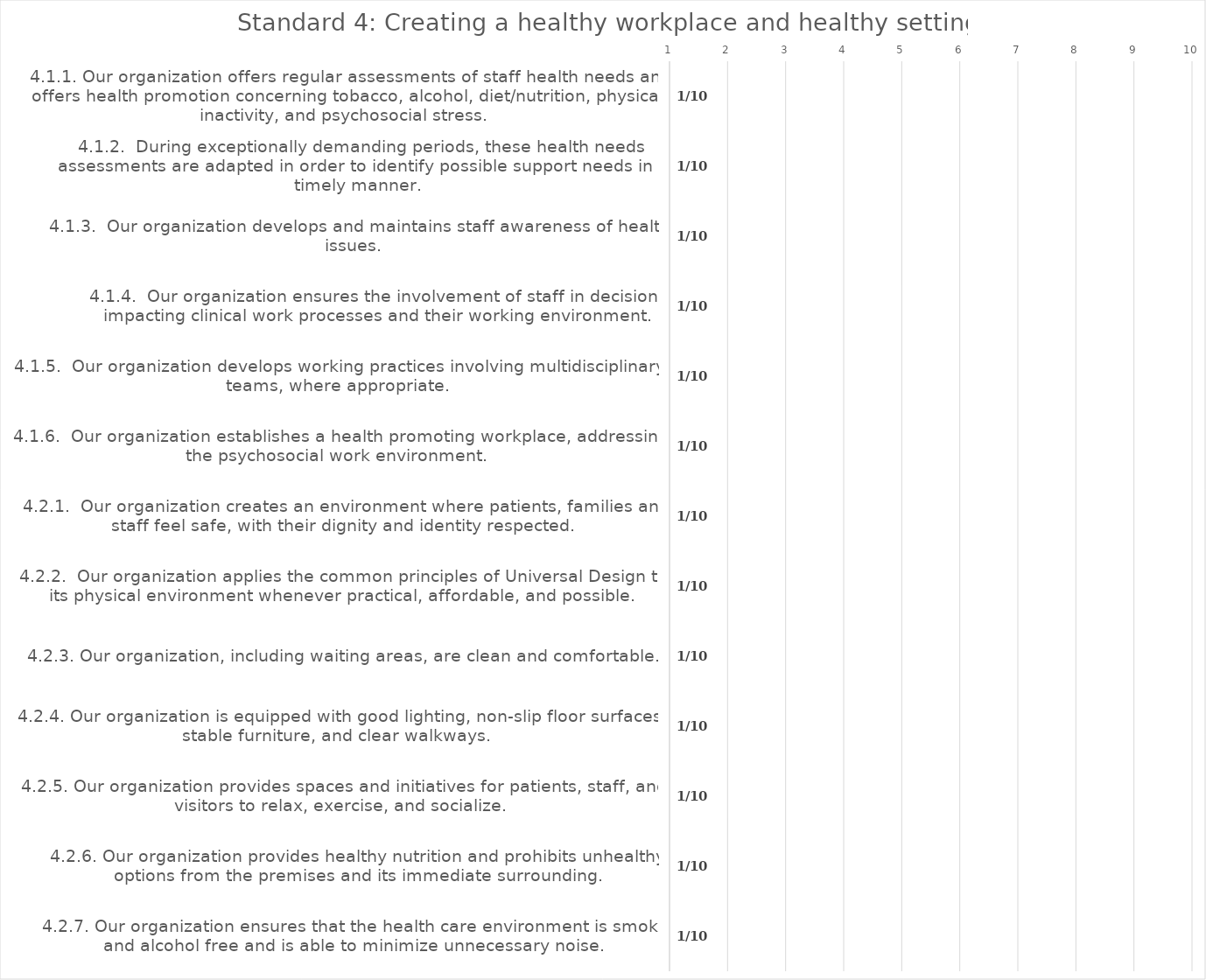
| Category | value |
|---|---|
| 4.1.1. Our organization offers regular assessments of staff health needs and offers health promotion concerning tobacco, alcohol, diet/nutrition, physical inactivity, and psychosocial stress. | 1 |
| 4.1.2.  During exceptionally demanding periods, these health needs assessments are adapted in order to identify possible support needs in a timely manner. | 1 |
| 4.1.3.  Our organization develops and maintains staff awareness of health issues. | 1 |
| 4.1.4.  Our organization ensures the involvement of staff in decisions impacting clinical work processes and their working environment. | 1 |
| 4.1.5.  Our organization develops working practices involving multidisciplinary teams, where appropriate. | 1 |
| 4.1.6.  Our organization establishes a health promoting workplace, addressing the psychosocial work environment. | 1 |
| 4.2.1.  Our organization creates an environment where patients, families and staff feel safe, with their dignity and identity respected. | 1 |
| 4.2.2.  Our organization applies the common principles of Universal Design to its physical environment whenever practical, affordable, and possible. | 1 |
| 4.2.3. Our organization, including waiting areas, are clean and comfortable.  | 1 |
| 4.2.4. Our organization is equipped with good lighting, non-slip floor surfaces, stable furniture, and clear walkways.  | 1 |
| 4.2.5. Our organization provides spaces and initiatives for patients, staff, and visitors to relax, exercise, and socialize. | 1 |
| 4.2.6. Our organization provides healthy nutrition and prohibits unhealthy options from the premises and its immediate surrounding. | 1 |
| 4.2.7. Our organization ensures that the health care environment is smoke and alcohol free and is able to minimize unnecessary noise. | 1 |